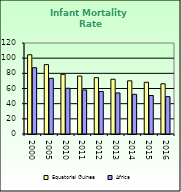
| Category | Equatorial Guinea | Africa |
|---|---|---|
| 2000.0 | 104.5 | 87.462 |
| 2005.0 | 91.5 | 73.418 |
| 2010.0 | 78.7 | 60.345 |
| 2011.0 | 76.4 | 58.107 |
| 2012.0 | 74.3 | 56.032 |
| 2013.0 | 72.2 | 54.131 |
| 2014.0 | 70.1 | 52.336 |
| 2015.0 | 68.2 | 50.754 |
| 2016.0 | 66.2 | 49.283 |